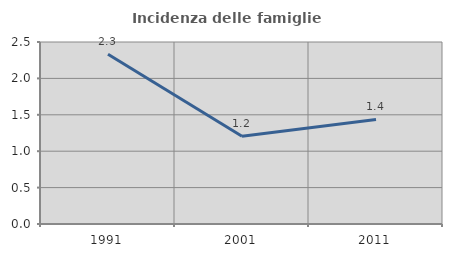
| Category | Incidenza delle famiglie numerose |
|---|---|
| 1991.0 | 2.332 |
| 2001.0 | 1.204 |
| 2011.0 | 1.436 |